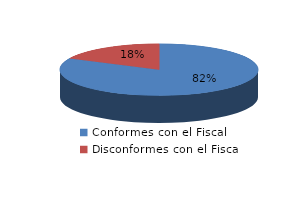
| Category | Series 0 |
|---|---|
| 0 | 2368 |
| 1 | 513 |